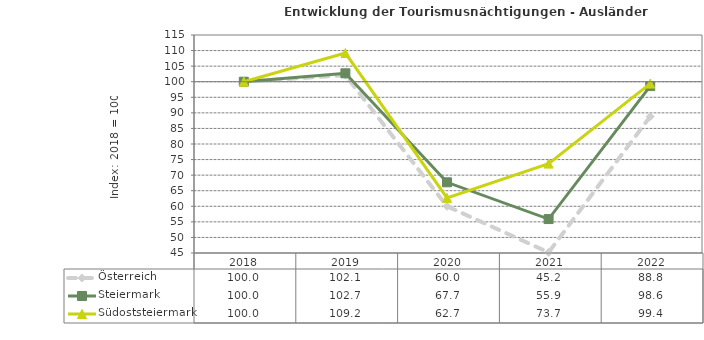
| Category | Österreich | Steiermark | Südoststeiermark |
|---|---|---|---|
| 2022.0 | 88.8 | 98.6 | 99.4 |
| 2021.0 | 45.2 | 55.9 | 73.7 |
| 2020.0 | 60 | 67.7 | 62.7 |
| 2019.0 | 102.1 | 102.7 | 109.2 |
| 2018.0 | 100 | 100 | 100 |